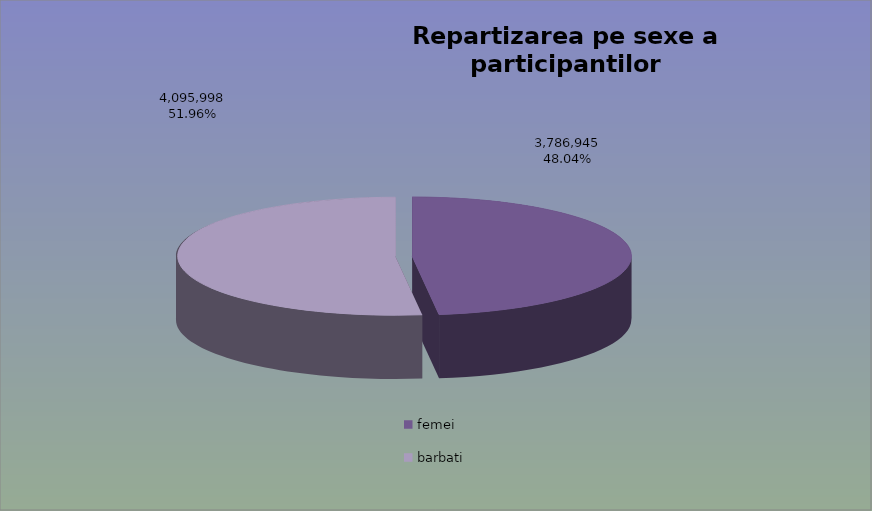
| Category | Series 0 |
|---|---|
| femei | 3786945 |
| barbati | 4095998 |